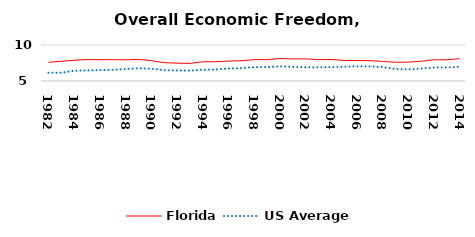
| Category | Florida | US Average |
|---|---|---|
| 1982.0 | 7.597 | 6.149 |
| 1983.0 | 7.739 | 6.152 |
| 1984.0 | 7.88 | 6.429 |
| 1985.0 | 7.976 | 6.464 |
| 1986.0 | 7.955 | 6.512 |
| 1987.0 | 7.964 | 6.552 |
| 1988.0 | 7.939 | 6.659 |
| 1989.0 | 7.999 | 6.767 |
| 1990.0 | 7.826 | 6.71 |
| 1991.0 | 7.545 | 6.502 |
| 1992.0 | 7.483 | 6.463 |
| 1993.0 | 7.438 | 6.446 |
| 1994.0 | 7.672 | 6.563 |
| 1995.0 | 7.674 | 6.593 |
| 1996.0 | 7.767 | 6.73 |
| 1997.0 | 7.81 | 6.781 |
| 1998.0 | 7.971 | 6.926 |
| 1999.0 | 7.971 | 6.925 |
| 2000.0 | 8.121 | 7.031 |
| 2001.0 | 8.073 | 6.969 |
| 2002.0 | 8.071 | 6.912 |
| 2003.0 | 7.973 | 6.892 |
| 2004.0 | 7.991 | 6.934 |
| 2005.0 | 7.852 | 6.99 |
| 2006.0 | 7.843 | 7.048 |
| 2007.0 | 7.827 | 7.028 |
| 2008.0 | 7.725 | 6.935 |
| 2009.0 | 7.597 | 6.668 |
| 2010.0 | 7.622 | 6.605 |
| 2011.0 | 7.746 | 6.72 |
| 2012.0 | 7.937 | 6.883 |
| 2013.0 | 7.954 | 6.881 |
| 2014.0 | 8.102 | 6.973 |